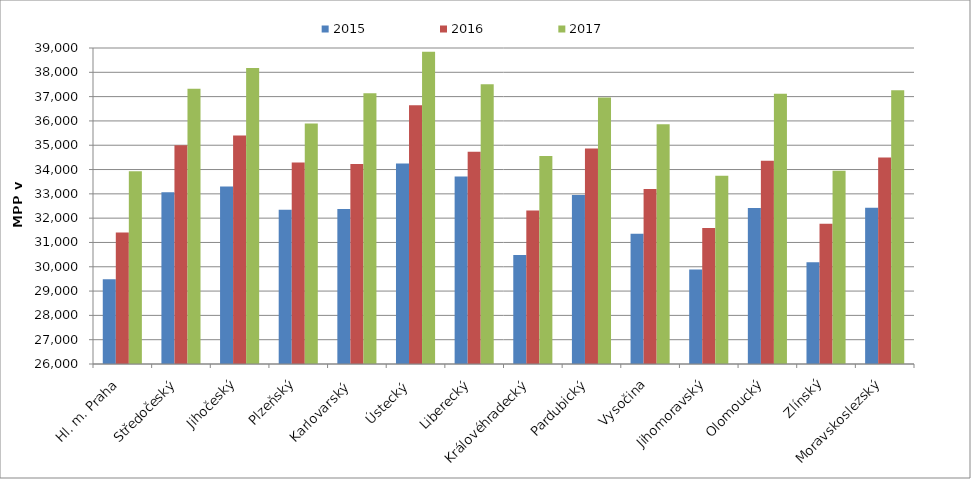
| Category | 2015 | 2016 | 2017 |
|---|---|---|---|
| Hl. m. Praha | 29483.059 | 31411.423 | 33925.266 |
| Středočeský | 33068.853 | 34999.504 | 37327.893 |
| Jihočeský | 33306.598 | 35398.472 | 38176.421 |
| Plzeňský | 32344.615 | 34289.231 | 35891.451 |
| Karlovarský  | 32378.855 | 34229.075 | 37136.564 |
| Ústecký   | 34248.245 | 36644.168 | 38843.035 |
| Liberecký | 33716.799 | 34733.325 | 37513.46 |
| Královéhradecký | 30480.692 | 32310.086 | 34559.078 |
| Pardubický | 32954.839 | 34867.097 | 36967.742 |
| Vysočina | 31358.321 | 33204.198 | 35860.87 |
| Jihomoravský | 29884.9 | 31597.721 | 33748.148 |
| Olomoucký | 32420.838 | 34366.088 | 37115.424 |
| Zlínský | 30183.272 | 31771.211 | 33948.104 |
| Moravskoslezský | 32432.432 | 34492.395 | 37258.972 |